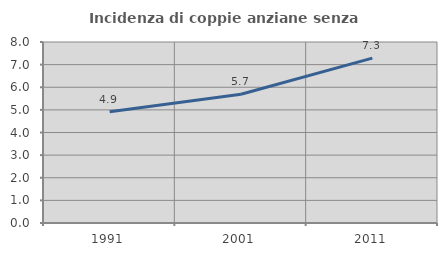
| Category | Incidenza di coppie anziane senza figli  |
|---|---|
| 1991.0 | 4.917 |
| 2001.0 | 5.69 |
| 2011.0 | 7.287 |